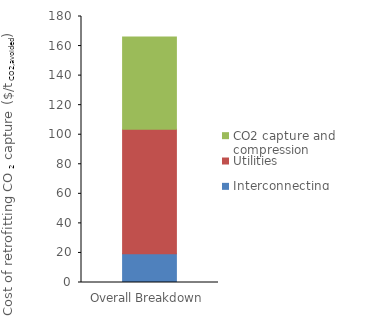
| Category | Interconnecting | Utilities | CO2 capture and compression |
|---|---|---|---|
| 0 | 19.467 | 84.25 | 62.473 |